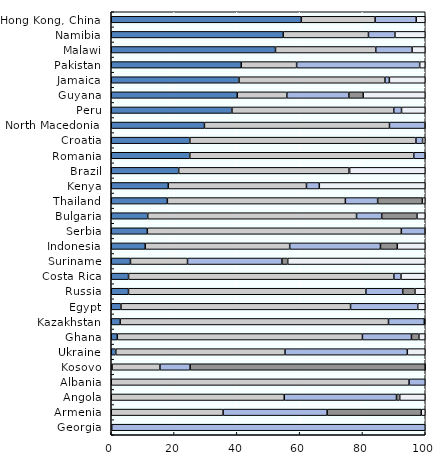
| Category | Equity | Bills and bonds | Cash and deposits | CIS (when look-through unavailable) | Other |
|---|---|---|---|---|---|
| Hong Kong, China | 60.533 | 23.502 | 13.085 | 0 | 2.88 |
| Namibia | 54.758 | 27.156 | 8.437 | 0 | 9.649 |
| Malawi | 52.313 | 31.927 | 11.571 | 0 | 4.189 |
| Pakistan | 41.405 | 17.634 | 39.189 | 0 | 1.772 |
| Jamaica | 40.686 | 46.473 | 1.412 | 0 | 11.429 |
| Guyana | 40.137 | 15.783 | 19.751 | 4.561 | 19.769 |
| Peru | 38.437 | 51.533 | 2.475 | 0 | 7.555 |
| North Macedonia | 29.674 | 58.936 | 11.29 | 0 | 0.1 |
| Croatia | 25.031 | 72.005 | 2.116 | 0 | 0.848 |
| Romania | 25.022 | 71.327 | 3.553 | 0 | 0.099 |
| Brazil | 21.481 | 54.269 | 0.162 | 0 | 24.087 |
| Kenya | 18.158 | 44.013 | 4.087 | 0 | 33.742 |
| Thailand | 17.866 | 56.688 | 10.285 | 14.238 | 0.923 |
| Bulgaria | 11.618 | 66.499 | 8.014 | 11.243 | 2.625 |
| Serbia | 11.494 | 80.882 | 7.522 | 0 | 0.101 |
| Indonesia | 10.819 | 46.008 | 28.902 | 5.367 | 8.904 |
| Suriname | 6.121 | 18.167 | 30.073 | 1.845 | 43.795 |
| Costa Rica | 5.512 | 84.487 | 2.274 | 0 | 7.727 |
| Russia | 5.492 | 75.612 | 11.72 | 3.898 | 3.279 |
| Egypt | 3.091 | 73.12 | 21.4 | 0 | 2.389 |
| Kazakhstan | 2.841 | 85.455 | 11.409 | 0 | 0.295 |
| Ghana | 1.931 | 78.063 | 15.611 | 2.37 | 2.025 |
| Ukraine | 1.45 | 53.875 | 38.967 | 0 | 5.708 |
| Kosovo | 0.263 | 15.245 | 9.604 | 74.882 | 0.006 |
| Albania | 0 | 94.841 | 5.159 | 0 | 0 |
| Angola | 0 | 55.095 | 35.749 | 1.029 | 8.127 |
| Armenia | 0 | 35.628 | 33.123 | 29.982 | 1.267 |
| Georgia | 0 | 0.145 | 99.855 | 0 | 0 |